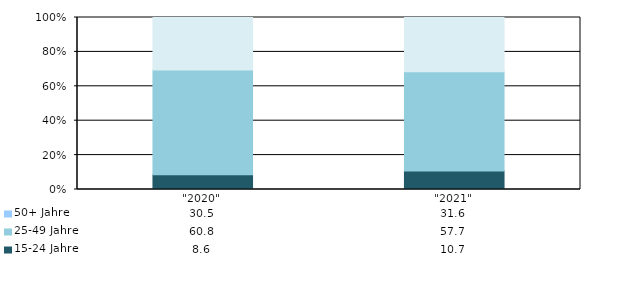
| Category | 15-24 Jahre | 25-49 Jahre | 50+ Jahre |
|---|---|---|---|
| "2020" | 8.6 | 60.8 | 30.5 |
| "2021" | 10.7 | 57.7 | 31.6 |